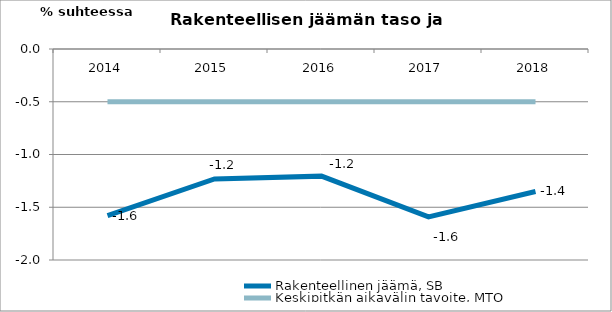
| Category | Rakenteellinen jäämä, SB | Keskipitkän aikavälin tavoite, MTO |
|---|---|---|
| 2014.0 | -1.579 | -0.5 |
| 2015.0 | -1.231 | -0.5 |
| 2016.0 | -1.205 | -0.5 |
| 2017.0 | -1.591 | -0.5 |
| 2018.0 | -1.351 | -0.5 |